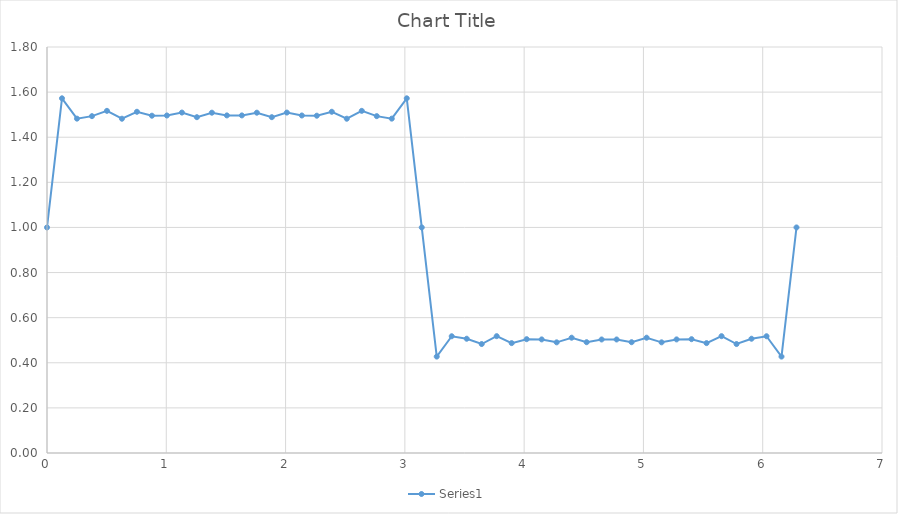
| Category | Series 0 |
|---|---|
| 0.0 | 1 |
| 0.125663706143592 | 1.573 |
| 0.251327412287183 | 1.482 |
| 0.376991118430775 | 1.493 |
| 0.502654824574367 | 1.517 |
| 0.628318530717959 | 1.482 |
| 0.75398223686155 | 1.513 |
| 0.879645943005142 | 1.495 |
| 1.005309649148734 | 1.496 |
| 1.130973355292325 | 1.509 |
| 1.256637061435917 | 1.489 |
| 1.382300767579509 | 1.509 |
| 1.5079644737231 | 1.497 |
| 1.633628179866692 | 1.497 |
| 1.759291886010284 | 1.509 |
| 1.884955592153875 | 1.489 |
| 2.010619298297467 | 1.509 |
| 2.136283004441059 | 1.496 |
| 2.261946710584651 | 1.495 |
| 2.387610416728243 | 1.513 |
| 2.513274122871835 | 1.482 |
| 2.638937829015427 | 1.517 |
| 2.764601535159019 | 1.493 |
| 2.890265241302611 | 1.482 |
| 3.015928947446203 | 1.573 |
| 3.141592653589794 | 1 |
| 3.267256359733386 | 0.427 |
| 3.392920065876978 | 0.518 |
| 3.51858377202057 | 0.507 |
| 3.644247478164162 | 0.483 |
| 3.769911184307754 | 0.518 |
| 3.895574890451346 | 0.487 |
| 4.021238596594937 | 0.505 |
| 4.14690230273853 | 0.504 |
| 4.27256600888212 | 0.491 |
| 4.398229715025713 | 0.511 |
| 4.523893421169304 | 0.491 |
| 4.649557127312897 | 0.503 |
| 4.775220833456489 | 0.503 |
| 4.900884539600081 | 0.491 |
| 5.026548245743672 | 0.511 |
| 5.152211951887264 | 0.491 |
| 5.277875658030856 | 0.504 |
| 5.403539364174448 | 0.505 |
| 5.52920307031804 | 0.487 |
| 5.654866776461632 | 0.518 |
| 5.780530482605224 | 0.483 |
| 5.906194188748815 | 0.507 |
| 6.031857894892407 | 0.518 |
| 6.157521601036 | 0.427 |
| 6.283185307179592 | 1 |